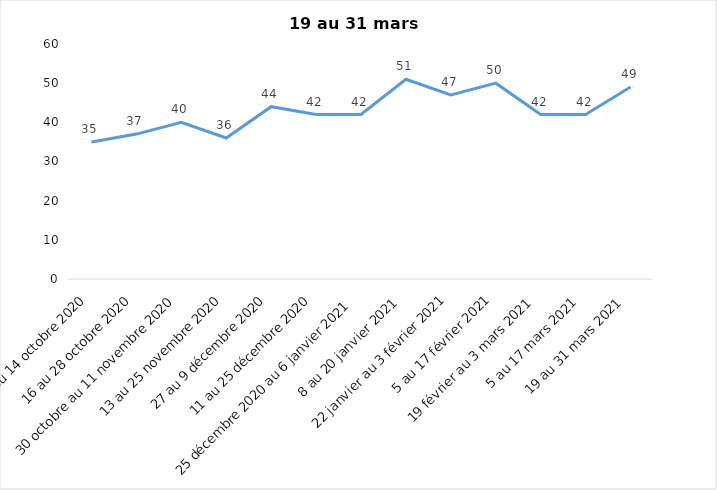
| Category | Toujours aux trois mesures |
|---|---|
| 2 au 14 octobre 2020 | 35 |
| 16 au 28 octobre 2020 | 37 |
| 30 octobre au 11 novembre 2020 | 40 |
| 13 au 25 novembre 2020 | 36 |
| 27 au 9 décembre 2020 | 44 |
| 11 au 25 décembre 2020 | 42 |
| 25 décembre 2020 au 6 janvier 2021 | 42 |
| 8 au 20 janvier 2021 | 51 |
| 22 janvier au 3 février 2021 | 47 |
| 5 au 17 février 2021 | 50 |
| 19 février au 3 mars 2021 | 42 |
| 5 au 17 mars 2021 | 42 |
| 19 au 31 mars 2021 | 49 |